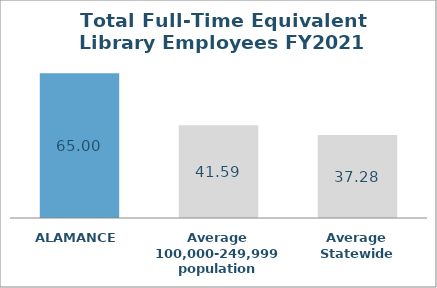
| Category | Series 0 |
|---|---|
| ALAMANCE | 65 |
| Average 100,000-249,999 population | 41.592 |
| Average Statewide | 37.285 |